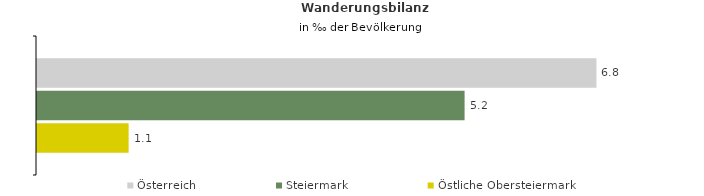
| Category | Österreich | Steiermark | Östliche Obersteiermark |
|---|---|---|---|
| Wanderungsrate in ‰ der Bevölkerung, Periode 2015-2019 | 6.771 | 5.175 | 1.109 |